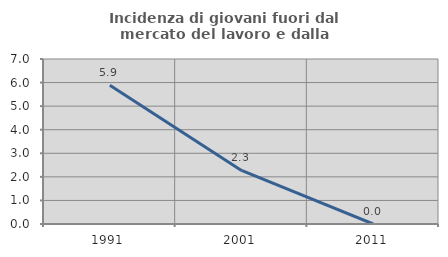
| Category | Incidenza di giovani fuori dal mercato del lavoro e dalla formazione  |
|---|---|
| 1991.0 | 5.882 |
| 2001.0 | 2.273 |
| 2011.0 | 0 |